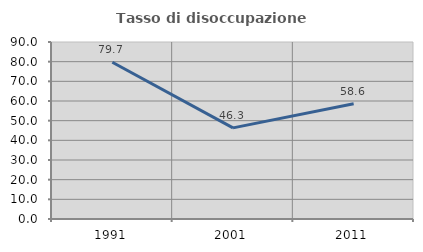
| Category | Tasso di disoccupazione giovanile  |
|---|---|
| 1991.0 | 79.688 |
| 2001.0 | 46.341 |
| 2011.0 | 58.621 |